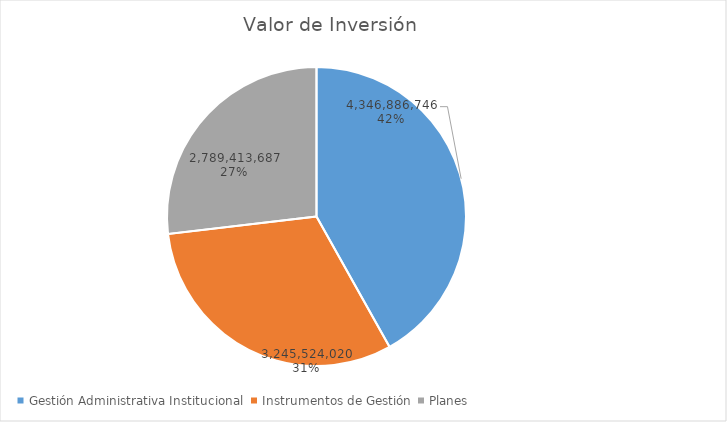
| Category | Valor de Inversión | Porcentaje de Ejecución dentro de la Actividad |
|---|---|---|
| Gestión Administrativa Institucional | 4346886746 | 15 |
| Instrumentos de Gestión | 3245524020 | 22 |
| Planes | 2789413687 | 23 |